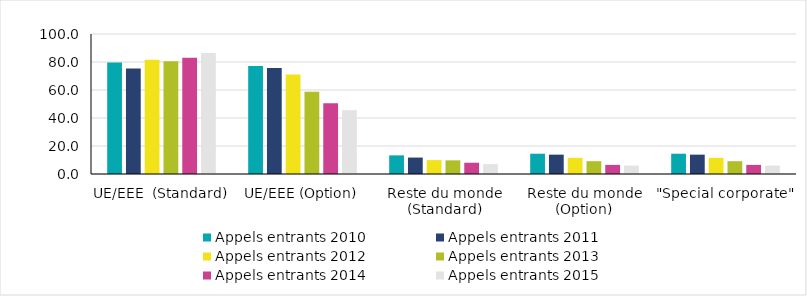
| Category | Appels entrants 2010 | Appels entrants 2011 | Appels entrants 2012 | Appels entrants 2013 | Appels entrants 2014 | Appels entrants 2015 |
|---|---|---|---|---|---|---|
| UE/EEE  (Standard) | 79.691 | 75.401 | 81.659 | 80.601 | 83.089 | 86.415 |
| UE/EEE (Option) | 77.154 | 75.797 | 71.147 | 58.747 | 50.538 | 45.556 |
| Reste du monde (Standard) | 13.319 | 11.742 | 9.923 | 9.754 | 8.04 | 7.04 |
| Reste du monde (Option) | 14.485 | 13.826 | 11.545 | 9.162 | 6.512 | 6.011 |
| "Special corporate" | 14.485 | 13.826 | 11.545 | 9.162 | 6.512 | 6.011 |